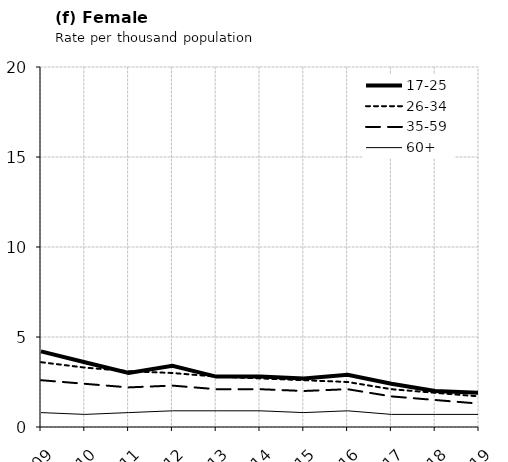
| Category | 17-25 | 26-34 | 35-59 | 60+ |
|---|---|---|---|---|
| 2009.0 | 4.2 | 3.6 | 2.6 | 0.8 |
| 2010.0 | 3.6 | 3.3 | 2.4 | 0.7 |
| 2011.0 | 3 | 3.1 | 2.2 | 0.8 |
| 2012.0 | 3.4 | 3 | 2.3 | 0.9 |
| 2013.0 | 2.8 | 2.8 | 2.1 | 0.9 |
| 2014.0 | 2.8 | 2.7 | 2.1 | 0.9 |
| 2015.0 | 2.7 | 2.6 | 2 | 0.8 |
| 2016.0 | 2.9 | 2.5 | 2.1 | 0.9 |
| 2017.0 | 2.4 | 2.1 | 1.7 | 0.7 |
| 2018.0 | 2 | 1.9 | 1.5 | 0.7 |
| 2019.0 | 1.9 | 1.7 | 1.3 | 0.7 |